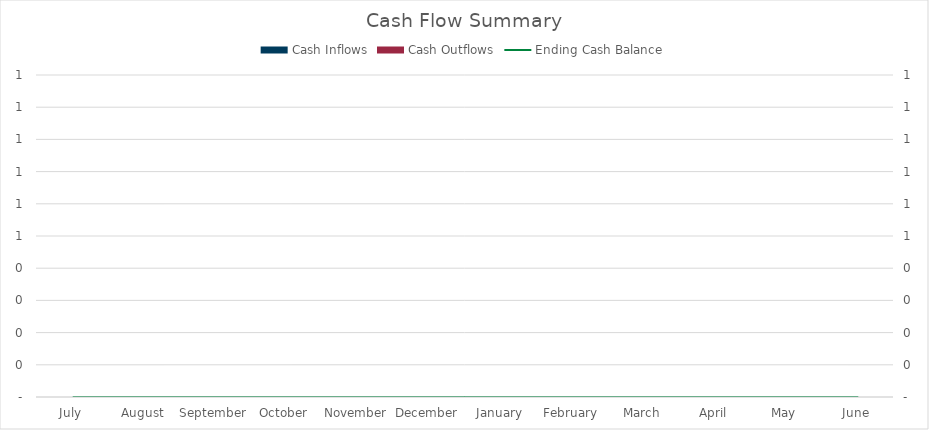
| Category | Cash Inflows | Cash Outflows |
|---|---|---|
| July | 0 | 0 |
| August | 0 | 0 |
| September | 0 | 0 |
| October | 0 | 0 |
| November | 0 | 0 |
| December | 0 | 0 |
| January | 0 | 0 |
| February | 0 | 0 |
| March | 0 | 0 |
| April | 0 | 0 |
| May | 0 | 0 |
| June | 0 | 0 |